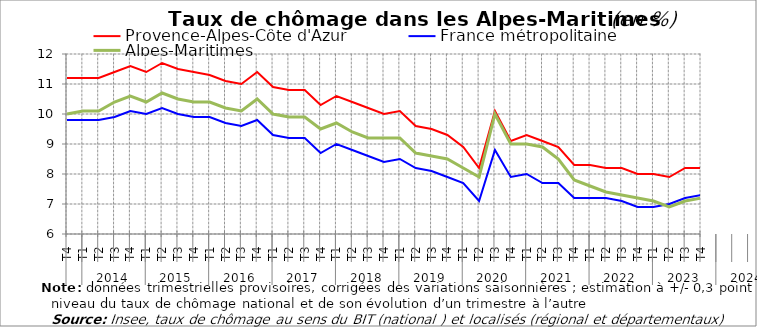
| Category | Provence-Alpes-Côte d'Azur | France métropolitaine | Alpes-Maritimes |
|---|---|---|---|
| 0 | 11.2 | 9.8 | 10 |
| 1 | 11.2 | 9.8 | 10.1 |
| 2 | 11.2 | 9.8 | 10.1 |
| 3 | 11.4 | 9.9 | 10.4 |
| 4 | 11.6 | 10.1 | 10.6 |
| 5 | 11.4 | 10 | 10.4 |
| 6 | 11.7 | 10.2 | 10.7 |
| 7 | 11.5 | 10 | 10.5 |
| 8 | 11.4 | 9.9 | 10.4 |
| 9 | 11.3 | 9.9 | 10.4 |
| 10 | 11.1 | 9.7 | 10.2 |
| 11 | 11 | 9.6 | 10.1 |
| 12 | 11.4 | 9.8 | 10.5 |
| 13 | 10.9 | 9.3 | 10 |
| 14 | 10.8 | 9.2 | 9.9 |
| 15 | 10.8 | 9.2 | 9.9 |
| 16 | 10.3 | 8.7 | 9.5 |
| 17 | 10.6 | 9 | 9.7 |
| 18 | 10.4 | 8.8 | 9.4 |
| 19 | 10.2 | 8.6 | 9.2 |
| 20 | 10 | 8.4 | 9.2 |
| 21 | 10.1 | 8.5 | 9.2 |
| 22 | 9.6 | 8.2 | 8.7 |
| 23 | 9.5 | 8.1 | 8.6 |
| 24 | 9.3 | 7.9 | 8.5 |
| 25 | 8.9 | 7.7 | 8.2 |
| 26 | 8.2 | 7.1 | 7.9 |
| 27 | 10.1 | 8.8 | 10 |
| 28 | 9.1 | 7.9 | 9 |
| 29 | 9.3 | 8 | 9 |
| 30 | 9.1 | 7.7 | 8.9 |
| 31 | 8.9 | 7.7 | 8.5 |
| 32 | 8.3 | 7.2 | 7.8 |
| 33 | 8.3 | 7.2 | 7.6 |
| 34 | 8.2 | 7.2 | 7.4 |
| 35 | 8.2 | 7.1 | 7.3 |
| 36 | 8 | 6.9 | 7.2 |
| 37 | 8 | 6.9 | 7.1 |
| 38 | 7.9 | 7 | 6.9 |
| 39 | 8.2 | 7.2 | 7.1 |
| 40 | 8.2 | 7.3 | 7.2 |